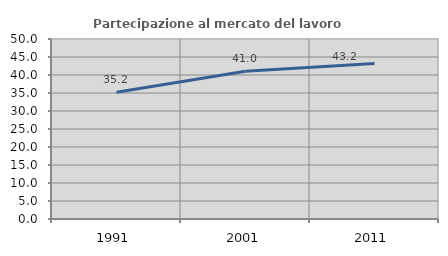
| Category | Partecipazione al mercato del lavoro  femminile |
|---|---|
| 1991.0 | 35.234 |
| 2001.0 | 41.021 |
| 2011.0 | 43.208 |